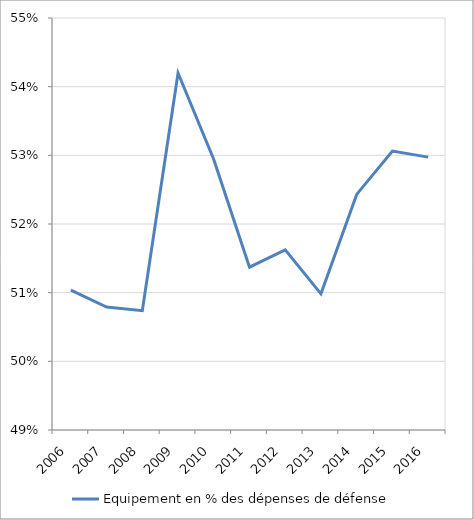
| Category | Equipement en % des dépenses de défense |
|---|---|
| 2006.0 | 0.51 |
| 2007.0 | 0.508 |
| 2008.0 | 0.507 |
| 2009.0 | 0.542 |
| 2010.0 | 0.529 |
| 2011.0 | 0.514 |
| 2012.0 | 0.516 |
| 2013.0 | 0.51 |
| 2014.0 | 0.524 |
| 2015.0 | 0.531 |
| 2016.0 | 0.53 |